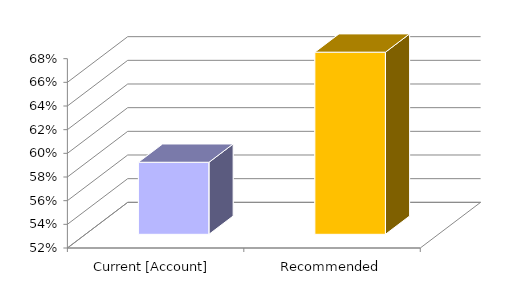
| Category | Series 0 |
|---|---|
| Current [Account] | 0.581 |
| Recommended | 0.674 |